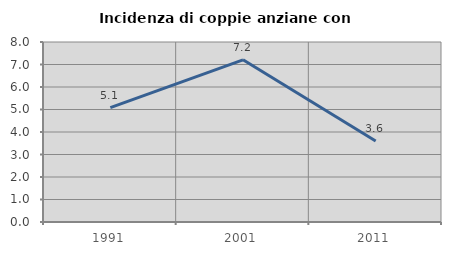
| Category | Incidenza di coppie anziane con figli |
|---|---|
| 1991.0 | 5.085 |
| 2001.0 | 7.207 |
| 2011.0 | 3.604 |